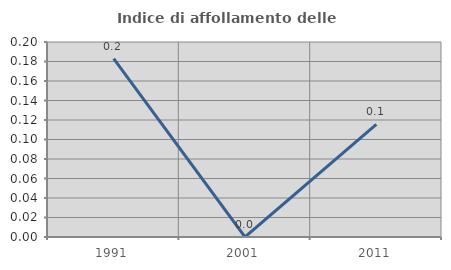
| Category | Indice di affollamento delle abitazioni  |
|---|---|
| 1991.0 | 0.183 |
| 2001.0 | 0 |
| 2011.0 | 0.115 |